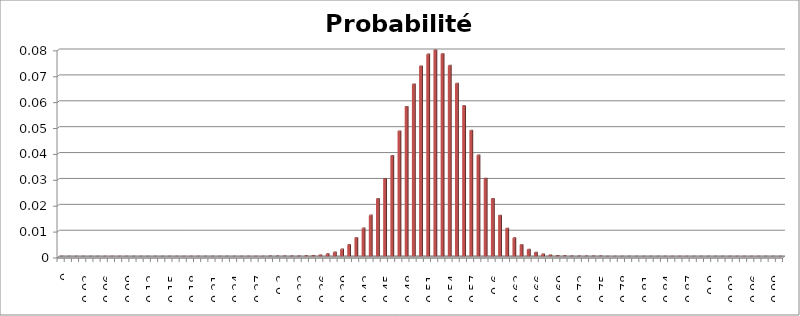
| Category | Probabilités |
|---|---|
| 0.0 | 0 |
| 0.01 | 0 |
| 0.02 | 0 |
| 0.03 | 0 |
| 0.04 | 0 |
| 0.05 | 0 |
| 0.06 | 0 |
| 0.07 | 0 |
| 0.08 | 0 |
| 0.09 | 0 |
| 0.1 | 0 |
| 0.11 | 0 |
| 0.12 | 0 |
| 0.13 | 0 |
| 0.14 | 0 |
| 0.15 | 0 |
| 0.16 | 0 |
| 0.17 | 0 |
| 0.18 | 0 |
| 0.19 | 0 |
| 0.2 | 0 |
| 0.21 | 0 |
| 0.22 | 0 |
| 0.23 | 0 |
| 0.24 | 0 |
| 0.25 | 0 |
| 0.26 | 0 |
| 0.27 | 0 |
| 0.28 | 0 |
| 0.29 | 0 |
| 0.3 | 0 |
| 0.31 | 0 |
| 0.32 | 0 |
| 0.33 | 0 |
| 0.34 | 0 |
| 0.35 | 0 |
| 0.36 | 0 |
| 0.37 | 0.001 |
| 0.38 | 0.002 |
| 0.39 | 0.003 |
| 0.4 | 0.004 |
| 0.41 | 0.007 |
| 0.42 | 0.011 |
| 0.43 | 0.016 |
| 0.44 | 0.022 |
| 0.45 | 0.03 |
| 0.46 | 0.039 |
| 0.47 | 0.048 |
| 0.48 | 0.058 |
| 0.49 | 0.066 |
| 0.5 | 0.073 |
| 0.51 | 0.078 |
| 0.52 | 0.08 |
| 0.53 | 0.078 |
| 0.54 | 0.074 |
| 0.55 | 0.067 |
| 0.56 | 0.058 |
| 0.57 | 0.049 |
| 0.58 | 0.039 |
| 0.59 | 0.03 |
| 0.6 | 0.022 |
| 0.61 | 0.016 |
| 0.62 | 0.011 |
| 0.63 | 0.007 |
| 0.64 | 0.004 |
| 0.65 | 0.003 |
| 0.66 | 0.002 |
| 0.67 | 0.001 |
| 0.68 | 0 |
| 0.69 | 0 |
| 0.7 | 0 |
| 0.71 | 0 |
| 0.72 | 0 |
| 0.73 | 0 |
| 0.74 | 0 |
| 0.75 | 0 |
| 0.76 | 0 |
| 0.77 | 0 |
| 0.78 | 0 |
| 0.79 | 0 |
| 0.8 | 0 |
| 0.81 | 0 |
| 0.82 | 0 |
| 0.83 | 0 |
| 0.84 | 0 |
| 0.85 | 0 |
| 0.86 | 0 |
| 0.87 | 0 |
| 0.88 | 0 |
| 0.89 | 0 |
| 0.9 | 0 |
| 0.91 | 0 |
| 0.92 | 0 |
| 0.93 | 0 |
| 0.94 | 0 |
| 0.95 | 0 |
| 0.96 | 0 |
| 0.97 | 0 |
| 0.98 | 0 |
| 0.99 | 0 |
| 1.0 | 0 |